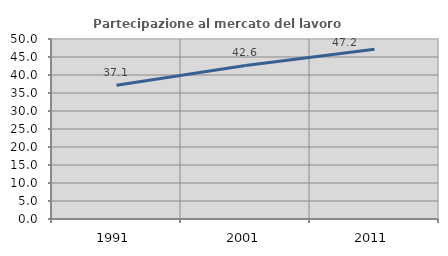
| Category | Partecipazione al mercato del lavoro  femminile |
|---|---|
| 1991.0 | 37.143 |
| 2001.0 | 42.64 |
| 2011.0 | 47.179 |